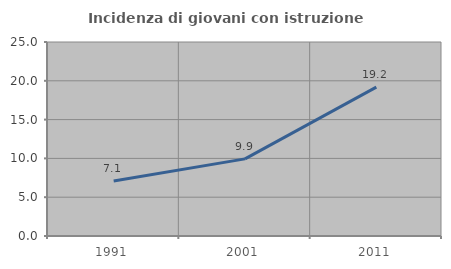
| Category | Incidenza di giovani con istruzione universitaria |
|---|---|
| 1991.0 | 7.084 |
| 2001.0 | 9.941 |
| 2011.0 | 19.18 |